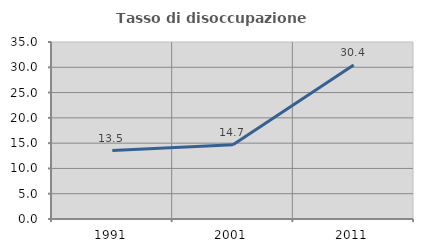
| Category | Tasso di disoccupazione giovanile  |
|---|---|
| 1991.0 | 13.542 |
| 2001.0 | 14.685 |
| 2011.0 | 30.435 |